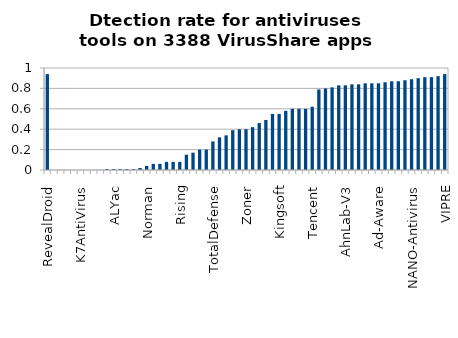
| Category | Series 0 | Series 1 |
|---|---|---|
| RevealDroid | 0.94 |  |
| nProtect | 0 |  |
| CMC | 0 |  |
| Malwarebytes | 0 |  |
| TheHacker | 0 |  |
| K7AntiVirus | 0 |  |
| SUPERAntiSpyware | 0 |  |
| PCTools | 0 |  |
| ByteHero | 0 |  |
| Agnitum | 0.01 |  |
| ALYac | 0.01 |  |
| Antiy-AVL | 0.01 |  |
| ViRobot | 0.01 |  |
| Panda | 0.01 |  |
| Zillya | 0.02 |  |
| Norman | 0.04 |  |
| Bkav | 0.06 |  |
| VBA32 | 0.06 |  |
| ClamAV | 0.08 |  |
| Microsoft | 0.08 |  |
| Rising | 0.08 |  |
| Alibaba | 0.15 |  |
| McAfee-GW-Edition | 0.17 |  |
| TrendMicro | 0.2 |  |
| Jiangmin | 0.2 |  |
| TotalDefense | 0.28 |  |
| Symantec | 0.32 |  |
| Commtouch | 0.34 |  |
| Cyren | 0.39 |  |
| TrendMicro-HouseCall | 0.4 |  |
| Zoner | 0.4 |  |
| AegisLab | 0.42 |  |
| AntiVir | 0.46 |  |
| Avira | 0.49 |  |
| CAT-QuickHeal | 0.55 |  |
| Kingsoft | 0.55 |  |
| K7GW | 0.58 |  |
| Avast | 0.6 |  |
| Kaspersky | 0.6 |  |
| Qihoo-360 | 0.6 |  |
| Tencent | 0.62 |  |
| DrWeb | 0.79 |  |
| Ikarus | 0.8 |  |
| AVware | 0.81 |  |
| F-Prot | 0.83 |  |
| AhnLab-V3 | 0.83 |  |
| Emsisoft | 0.84 |  |
| Fortinet | 0.84 |  |
| MicroWorld-eScan | 0.85 |  |
| BitDefender | 0.85 |  |
| Ad-Aware | 0.85 |  |
| GData | 0.86 |  |
| F-Secure | 0.87 |  |
| Baidu-International | 0.87 |  |
| Sophos | 0.88 |  |
| NANO-Antivirus | 0.89 |  |
| Comodo | 0.9 |  |
| McAfee | 0.91 |  |
| AVG | 0.91 |  |
| ESET-NOD32 | 0.92 |  |
| VIPRE | 0.94 |  |